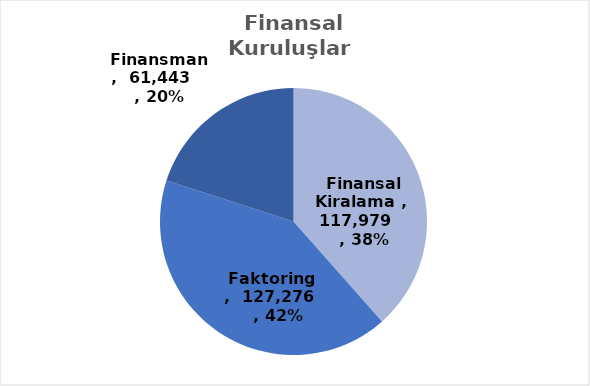
| Category | Series 0 |
|---|---|
| Finansal Kiralama  | 117979 |
| Faktoring  | 127276 |
| Finansman | 61443 |